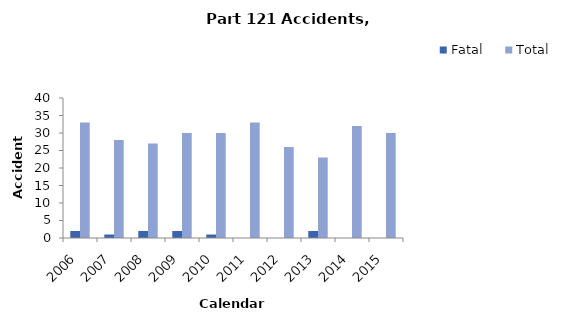
| Category | Fatal | Total |
|---|---|---|
| 2006.0 | 2 | 33 |
| 2007.0 | 1 | 28 |
| 2008.0 | 2 | 27 |
| 2009.0 | 2 | 30 |
| 2010.0 | 1 | 30 |
| 2011.0 | 0 | 33 |
| 2012.0 | 0 | 26 |
| 2013.0 | 2 | 23 |
| 2014.0 | 0 | 32 |
| 2015.0 | 0 | 30 |